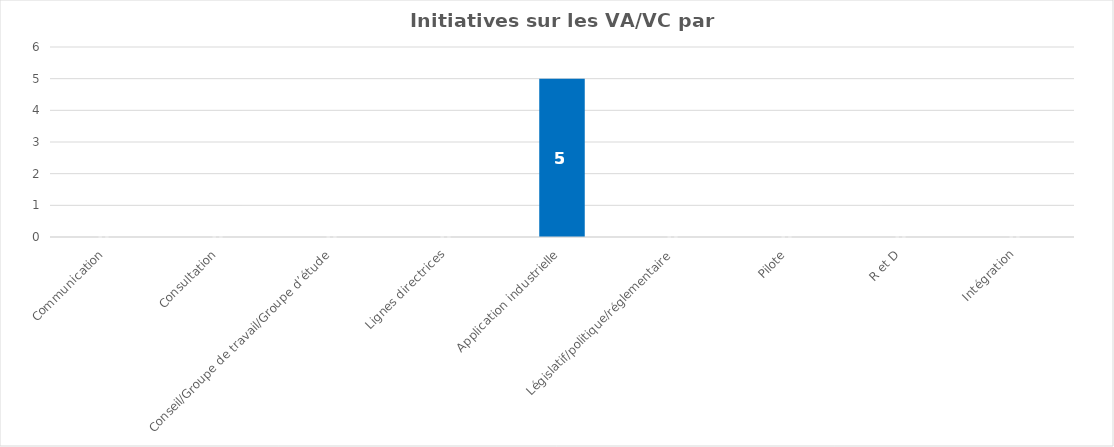
| Category | Series 0 |
|---|---|
| Communication | 0 |
| Consultation | 0 |
| Conseil/Groupe de travail/Groupe d’étude | 0 |
| Lignes directrices | 0 |
| Application industrielle | 5 |
| Législatif/politique/réglementaire | 0 |
| Pilote | 0 |
| R et D | 0 |
| Intégration | 0 |